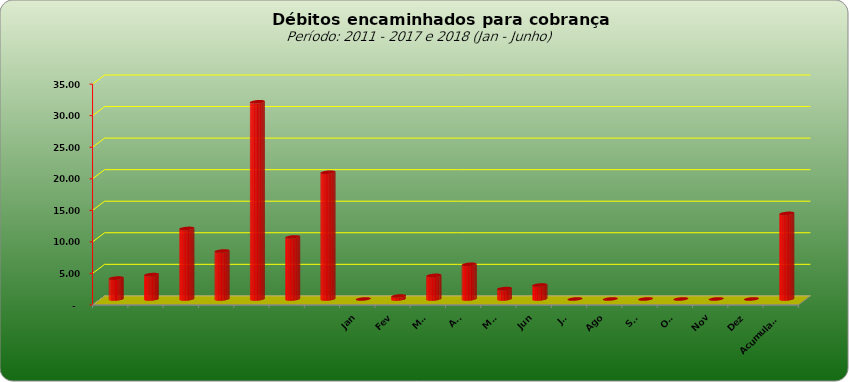
| Category |  3.309.443,02  |
|---|---|
|  | 3309443.02 |
|  | 3859728.44 |
|  | 11181928.25 |
|  | 7600526.01 |
|  | 31248623.5 |
|  | 9830198.34 |
|  | 20083556.95 |
| Jan | 0 |
| Fev | 468831.1 |
| Mar | 3741527.45 |
| Abr | 5493663.59 |
| Mai | 1643658.45 |
| Jun | 2215524.43 |
| Jul | 0 |
| Ago | 0 |
| Set | 0 |
| Out | 0 |
| Nov | 0 |
| Dez | 0 |
| Acumulado | 13563205.02 |